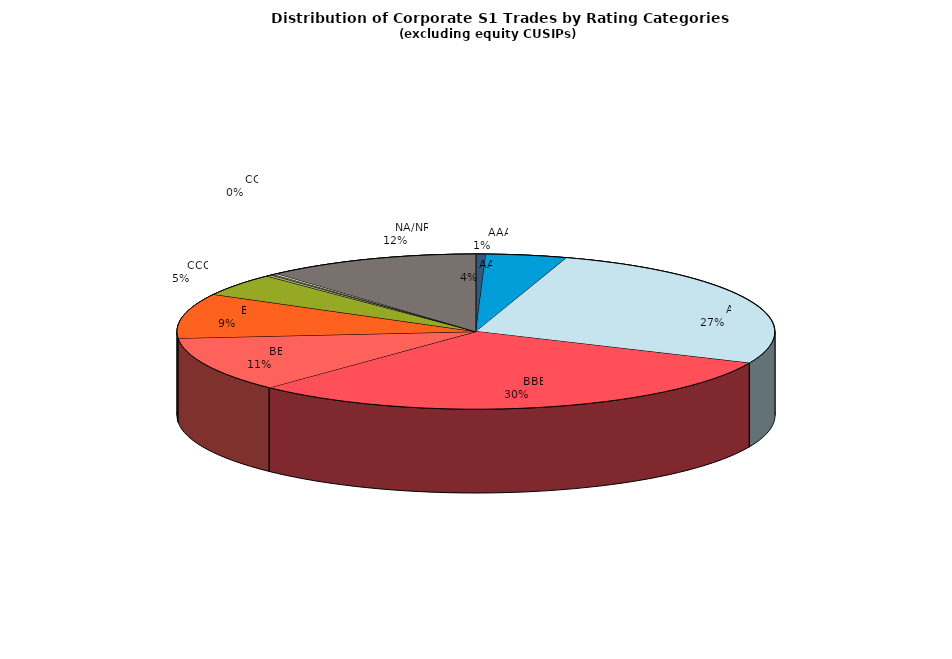
| Category | Series 0 |
|---|---|
|         AAA | 233.865 |
|         AA | 1942.809 |
|         A | 11864.211 |
|         BBB | 13518.657 |
|         BB | 5095.888 |
|         B | 4134.793 |
|         CCC | 2094.116 |
|         CC | 142.283 |
|         C | 77.777 |
|         D | 103.502 |
|         NA/NR | 5136.179 |